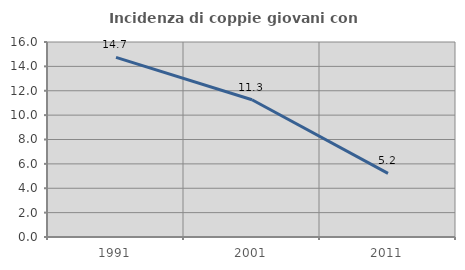
| Category | Incidenza di coppie giovani con figli |
|---|---|
| 1991.0 | 14.744 |
| 2001.0 | 11.258 |
| 2011.0 | 5.224 |